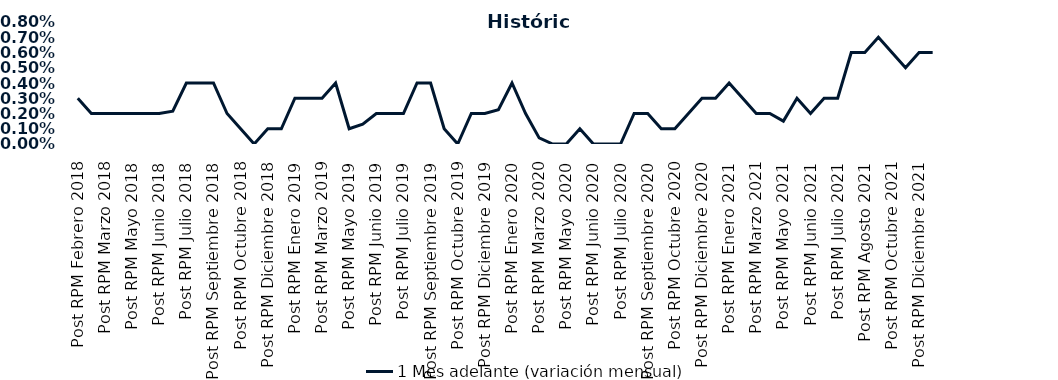
| Category | 1 Mes adelante (variación mensual) |
|---|---|
| Post RPM Febrero 2018 | 0.003 |
| Pre RPM Marzo 2018 | 0.002 |
| Post RPM Marzo 2018 | 0.002 |
| Pre RPM Mayo 2018 | 0.002 |
| Post RPM Mayo 2018 | 0.002 |
| Pre RPM Junio 2018 | 0.002 |
| Post RPM Junio 2018 | 0.002 |
| Pre RPM Julio 2018 | 0.002 |
| Post RPM Julio 2018 | 0.004 |
| Pre RPM Septiembre 2018 | 0.004 |
| Post RPM Septiembre 2018 | 0.004 |
| Pre RPM Octubre 2018 | 0.002 |
| Post RPM Octubre 2018 | 0.001 |
| Pre RPM Diciembre 2018 | 0 |
| Post RPM Diciembre 2018 | 0.001 |
| Pre RPM Enero 2019 | 0.001 |
| Post RPM Enero 2019 | 0.003 |
| Pre RPM Marzo 2019 | 0.003 |
| Post RPM Marzo 2019 | 0.003 |
| Pre RPM Mayo 2019 | 0.004 |
| Post RPM Mayo 2019 | 0.001 |
| Pre RPM Junio 2019 | 0.001 |
| Post RPM Junio 2019 | 0.002 |
| Pre RPM Julio 2019 | 0.002 |
| Post RPM Julio 2019 | 0.002 |
| Pre RPM Septiembre 2019 | 0.004 |
| Post RPM Septiembre 2019 | 0.004 |
| Pre RPM Octubre 2019 | 0.001 |
| Post RPM Octubre 2019 | 0 |
| Pre RPM Diciembre 2019 | 0.002 |
| Post RPM Diciembre 2019 | 0.002 |
| Pre RPM Enero 2020 | 0.002 |
| Post RPM Enero 2020 | 0.004 |
| Pre RPM Marzo 2020 | 0.002 |
| Post RPM Marzo 2020 | 0 |
| Pre RPM Mayo 2020 | 0 |
| Post RPM Mayo 2020 | 0 |
| Pre RPM Junio 2020 | 0.001 |
| Post RPM Junio 2020 | 0 |
| Pre RPM Julio 2020 | 0 |
| Post RPM Julio 2020 | 0 |
| Pre RPM Septiembre 2020 | 0.002 |
| Post RPM Septiembre 2020 | 0.002 |
| Pre RPM Octubre 2020 | 0.001 |
| Post RPM Octubre 2020 | 0.001 |
| Pre RPM Diciembre 2020 | 0.002 |
| Post RPM Diciembre 2020 | 0.003 |
| Pre RPM Enero 2021 | 0.003 |
| Post RPM Enero 2021 | 0.004 |
| Pre RPM Marzo 2021 | 0.003 |
| Post RPM Marzo 2021 | 0.002 |
| Pre RPM Mayo 2021 | 0.002 |
| Post RPM Mayo 2021 | 0.002 |
| Pre RPM Junio 2021 | 0.003 |
| Post RPM Junio 2021 | 0.002 |
| Pre RPM Julio 2021 | 0.003 |
| Post RPM Julio 2021 | 0.003 |
| Pre RPM Agosto 2021 | 0.006 |
| Post RPM Agosto 2021 | 0.006 |
| Pre RPM Octubre 2021 | 0.007 |
| Post RPM Octubre 2021 | 0.006 |
| Pre RPM Diciembre 2021 | 0.005 |
| Post RPM Diciembre 2021 | 0.006 |
| Pre RPM Enero 2022 | 0.006 |